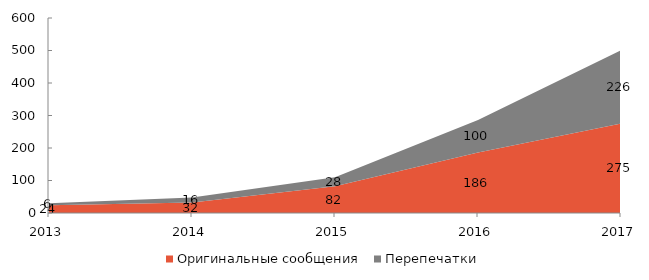
| Category | Оригинальные сообщения | Перепечатки |
|---|---|---|
| 2013 | 24 | 6 |
| 2014 | 32 | 16 |
| 2015 | 82 | 28 |
| 2016 | 186 | 100 |
| 2017 | 275 | 226 |